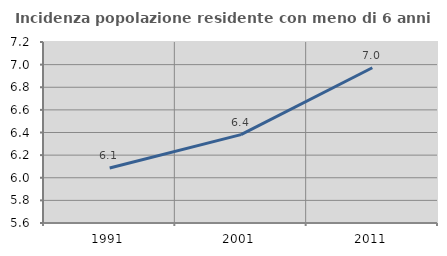
| Category | Incidenza popolazione residente con meno di 6 anni |
|---|---|
| 1991.0 | 6.086 |
| 2001.0 | 6.381 |
| 2011.0 | 6.972 |